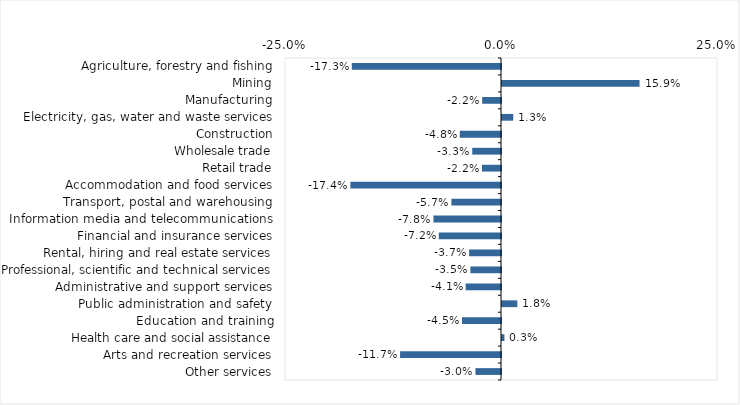
| Category | This week |
|---|---|
| Agriculture, forestry and fishing | -0.173 |
| Mining | 0.159 |
| Manufacturing | -0.022 |
| Electricity, gas, water and waste services | 0.013 |
| Construction | -0.048 |
| Wholesale trade | -0.033 |
| Retail trade | -0.022 |
| Accommodation and food services | -0.174 |
| Transport, postal and warehousing | -0.057 |
| Information media and telecommunications | -0.078 |
| Financial and insurance services | -0.072 |
| Rental, hiring and real estate services | -0.037 |
| Professional, scientific and technical services | -0.035 |
| Administrative and support services | -0.041 |
| Public administration and safety | 0.018 |
| Education and training | -0.045 |
| Health care and social assistance | 0.003 |
| Arts and recreation services | -0.117 |
| Other services | -0.03 |